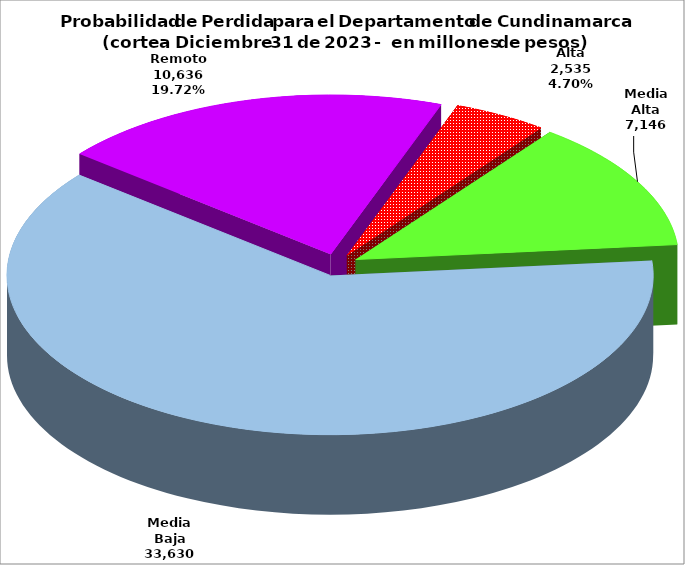
| Category | Series 0 |
|---|---|
| Alta | 2534.522 |
| Media Alta | 7146.205 |
| Media Baja | 33629.974 |
| Remoto | 10635.92 |